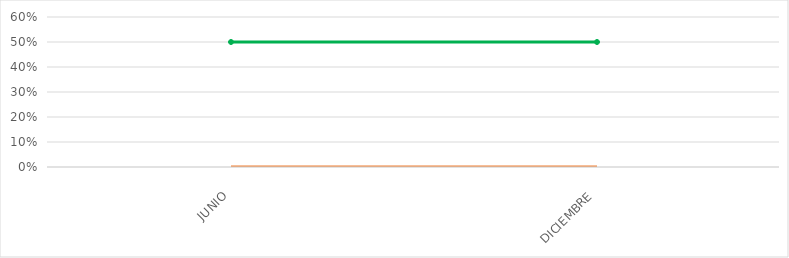
| Category | VALOR  | META PONDERADA |
|---|---|---|
| JUNIO | 0 | 0.5 |
| DICIEMBRE | 0 | 0.5 |